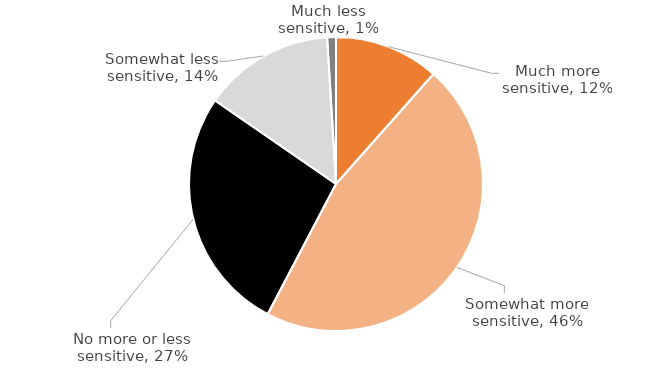
| Category | Series 0 |
|---|---|
| Much more sensitive | 0.115 |
| Somewhat more sensitive | 0.462 |
| No more or less sensitive | 0.269 |
| Somewhat less sensitive | 0.144 |
| Much less sensitive | 0.01 |